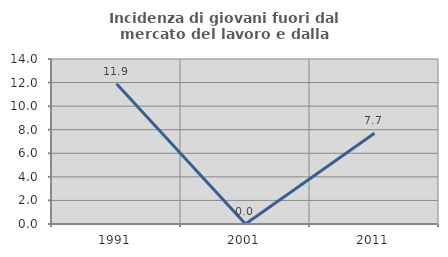
| Category | Incidenza di giovani fuori dal mercato del lavoro e dalla formazione  |
|---|---|
| 1991.0 | 11.905 |
| 2001.0 | 0 |
| 2011.0 | 7.692 |